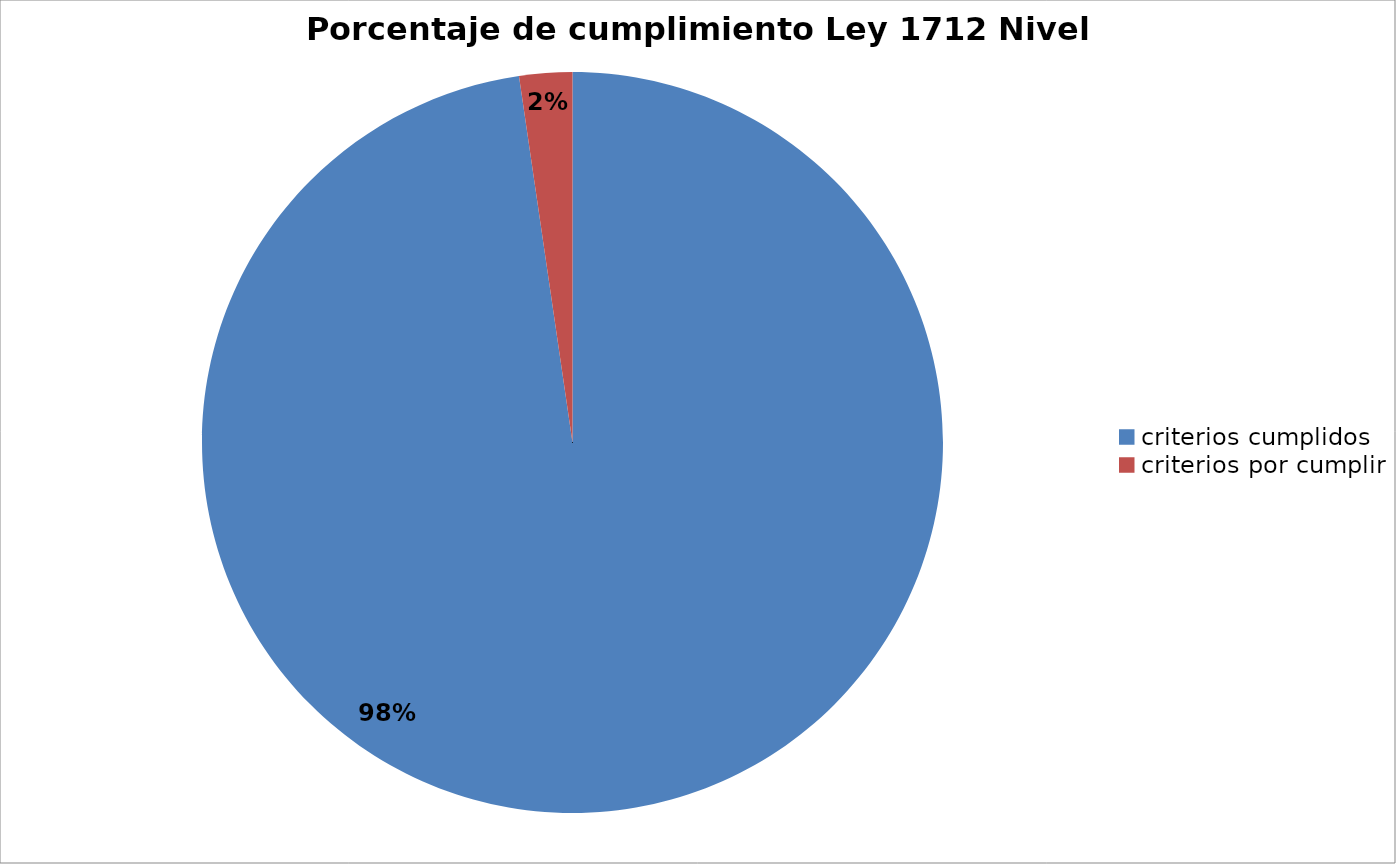
| Category | Series 0 |
|---|---|
| criterios cumplidos | 127 |
| criterios por cumplir | 3 |